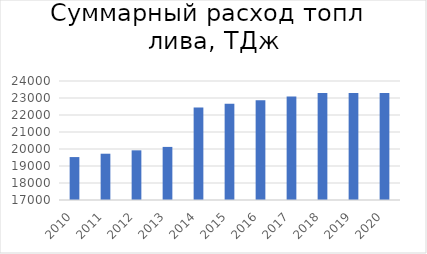
| Category | TДж |
|---|---|
| 2010.0 | 19525.278 |
| 2011.0 | 19722.503 |
| 2012.0 | 19921.72 |
| 2013.0 | 20122.949 |
| 2014.0 | 22439.895 |
| 2015.0 | 22666.561 |
| 2016.0 | 22873.95 |
| 2017.0 | 23083.434 |
| 2018.0 | 23295.034 |
| 2019.0 | 23295.034 |
| 2020.0 | 23295.034 |